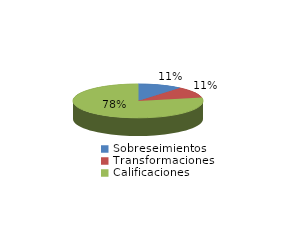
| Category | Series 0 |
|---|---|
| Sobreseimientos | 274 |
| Transformaciones | 265 |
| Calificaciones | 1929 |